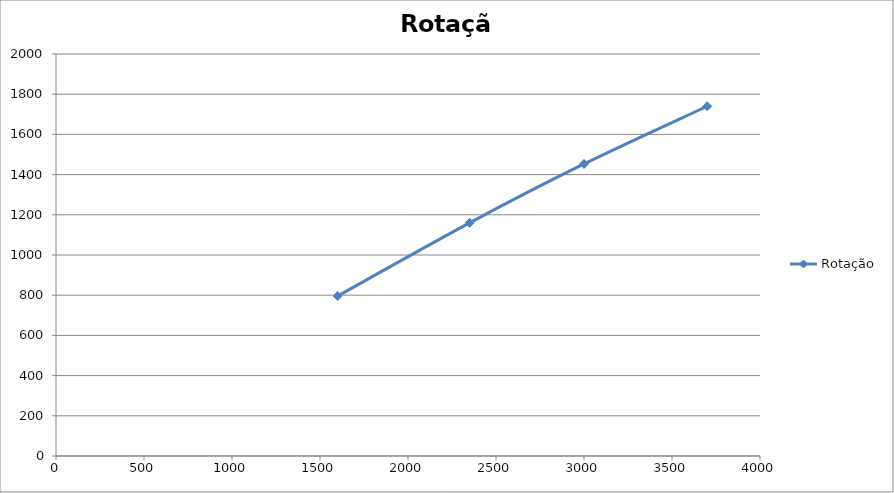
| Category | Rotação |
|---|---|
| 1600.0 | 796 |
| 2350.0 | 1160 |
| 3000.0 | 1453 |
| 3700.0 | 1740 |